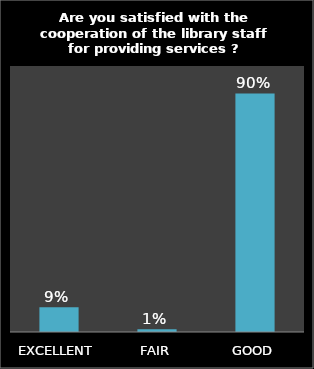
| Category | Series 0 |
|---|---|
| EXCELLENT | 0.093 |
| FAIR | 0.01 |
| GOOD | 0.897 |